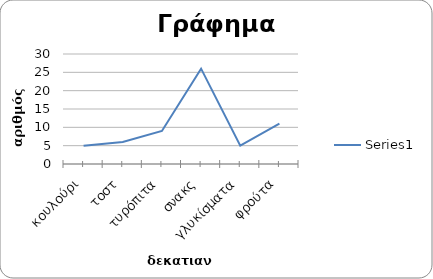
| Category | Series 0 |
|---|---|
| κουλούρι | 5 |
| τοστ | 6 |
| τυρόπιτα | 9 |
| σνακς | 26 |
| γλυκίσματα | 5 |
| φρούτα | 11 |